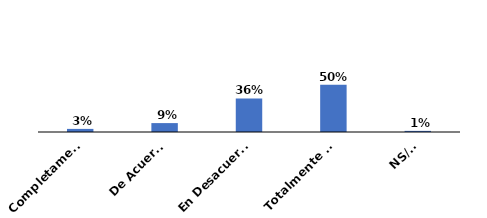
| Category | Series 0 |
|---|---|
| Completamente de acuerdo | 0.033 |
| De Acuerdo | 0.095 |
| En Desacuerdo | 0.356 |
| Totalmente en desacuerdo | 0.504 |
| NS/NR | 0.012 |